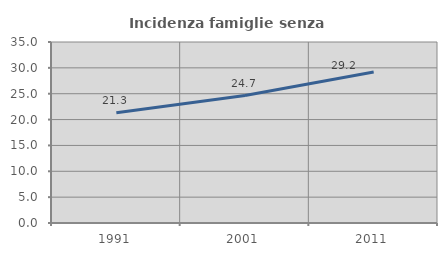
| Category | Incidenza famiglie senza nuclei |
|---|---|
| 1991.0 | 21.311 |
| 2001.0 | 24.654 |
| 2011.0 | 29.188 |